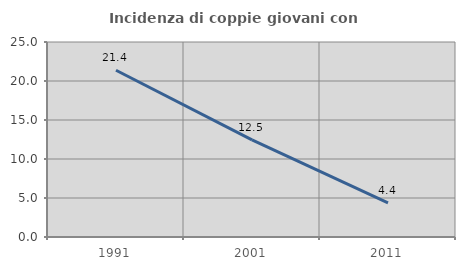
| Category | Incidenza di coppie giovani con figli |
|---|---|
| 1991.0 | 21.379 |
| 2001.0 | 12.453 |
| 2011.0 | 4.386 |